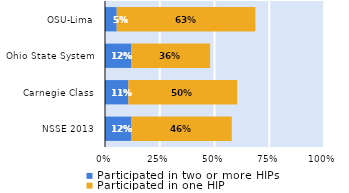
| Category | Participated in two or more HIPs | Participated in one HIP |
|---|---|---|
| NSSE 2013 | 0.119 | 0.46 |
| Carnegie Class | 0.107 | 0.497 |
| Ohio State System | 0.12 | 0.36 |
| OSU-Lima | 0.054 | 0.633 |